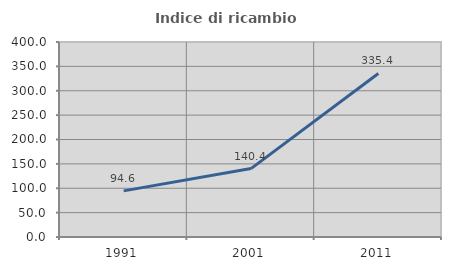
| Category | Indice di ricambio occupazionale  |
|---|---|
| 1991.0 | 94.643 |
| 2001.0 | 140.351 |
| 2011.0 | 335.417 |